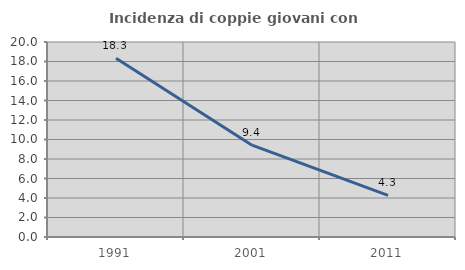
| Category | Incidenza di coppie giovani con figli |
|---|---|
| 1991.0 | 18.341 |
| 2001.0 | 9.416 |
| 2011.0 | 4.261 |